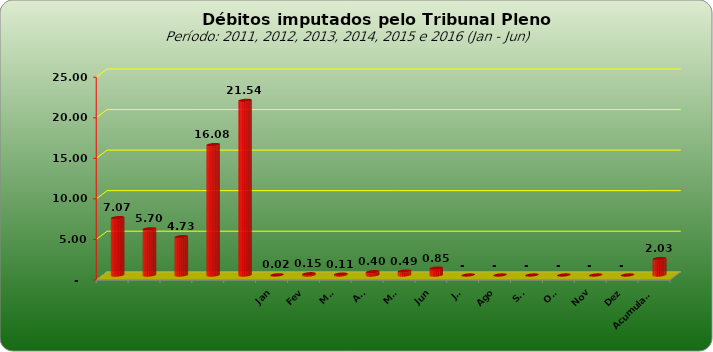
| Category |  7.073.154,74  |
|---|---|
|  | 7073154.74 |
|  | 5698720.25 |
|  | 4727033.51 |
|  | 16081820.48 |
|  | 21535723.6 |
| Jan | 22059.63 |
| Fev | 154318.14 |
| Mar | 112460.95 |
| Abr | 404403.01 |
| Mai | 486409.52 |
| Jun | 852405.84 |
| Jul | 0 |
| Ago | 0 |
| Set | 0 |
| Out | 0 |
| Nov | 0 |
| Dez | 0 |
| Acumulado | 2032057.09 |